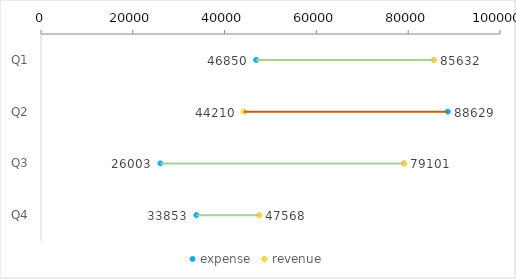
| Category | Series 0 |
|---|---|
| Q1 | 46850 |
| Q2 | 88629 |
| Q3 | 26003 |
| Q4 | 33853 |